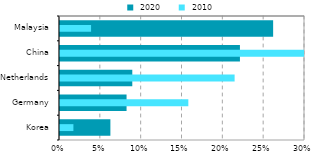
| Category |  2020 |
|---|---|
| Korea | 0.062 |
| Germany | 0.082 |
| Netherlands | 0.089 |
| China | 0.22 |
| Malaysia | 0.261 |